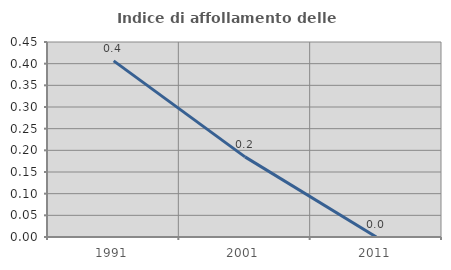
| Category | Indice di affollamento delle abitazioni  |
|---|---|
| 1991.0 | 0.407 |
| 2001.0 | 0.185 |
| 2011.0 | 0 |